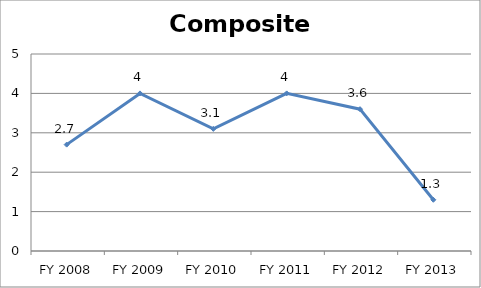
| Category | Composite score |
|---|---|
| FY 2013 | 1.3 |
| FY 2012 | 3.6 |
| FY 2011 | 4 |
| FY 2010 | 3.1 |
| FY 2009 | 4 |
| FY 2008 | 2.7 |